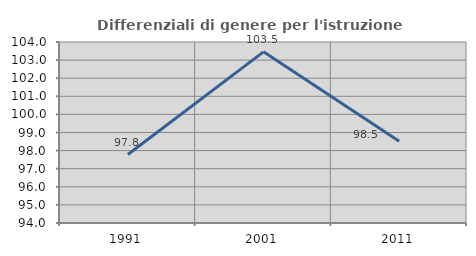
| Category | Differenziali di genere per l'istruzione superiore |
|---|---|
| 1991.0 | 97.781 |
| 2001.0 | 103.457 |
| 2011.0 | 98.52 |